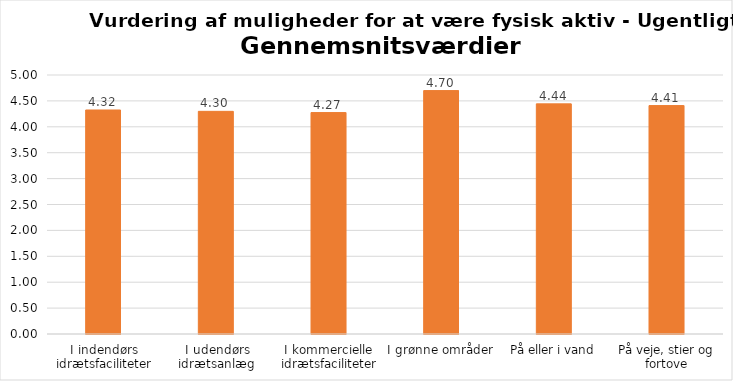
| Category | Gennemsnit |
|---|---|
| I indendørs idrætsfaciliteter | 4.325 |
| I udendørs idrætsanlæg | 4.298 |
| I kommercielle idrætsfaciliteter | 4.275 |
| I grønne områder | 4.699 |
| På eller i vand | 4.443 |
| På veje, stier og fortove | 4.41 |